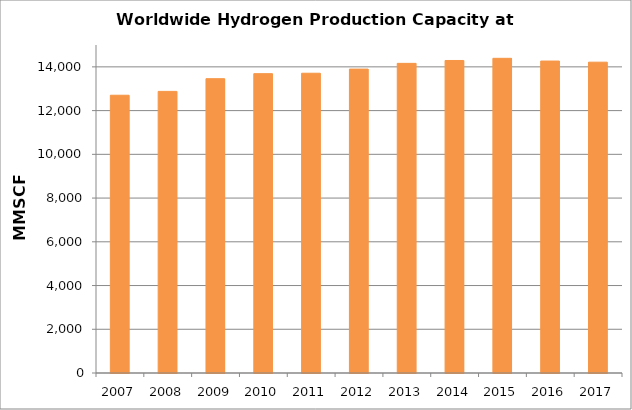
| Category | Series 0 |
|---|---|
| 2007.0 | 12702.3 |
| 2008.0 | 12878.2 |
| 2009.0 | 13459.9 |
| 2010.0 | 13689.3 |
| 2011.0 | 13708.5 |
| 2012.0 | 13898.6 |
| 2013.0 | 14160 |
| 2014.0 | 14291.6 |
| 2015.0 | 14391.1 |
| 2016.0 | 14265.9 |
| 2017.0 | 14214.4 |